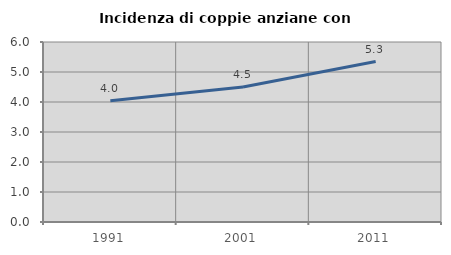
| Category | Incidenza di coppie anziane con figli |
|---|---|
| 1991.0 | 4.044 |
| 2001.0 | 4.497 |
| 2011.0 | 5.348 |